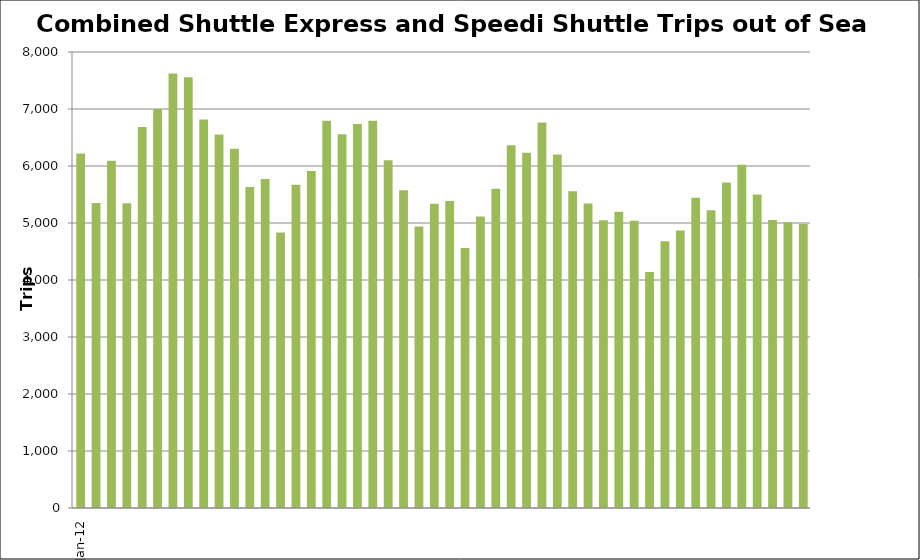
| Category | Shuttle Express |
|---|---|
| 2012-01-31 | 6218 |
| 2012-02-29 | 5351 |
| 2012-03-31 | 6093 |
| 2012-04-30 | 5348 |
| 2012-05-31 | 6683 |
| 2012-06-30 | 6998 |
| 2012-07-31 | 7622 |
| 2012-08-31 | 7558 |
| 2012-09-30 | 6817 |
| 2012-10-31 | 6553 |
| 2012-11-30 | 6301 |
| 2012-12-31 | 5632 |
| 2013-01-31 | 5770 |
| 2013-02-28 | 4833 |
| 2013-03-31 | 5669 |
| 2013-04-30 | 5912 |
| 2013-05-31 | 6793 |
| 2013-06-30 | 6559 |
| 2013-07-31 | 6738 |
| 2013-08-31 | 6793 |
| 2013-09-30 | 6101 |
| 2013-10-31 | 5576 |
| 2013-11-30 | 4939 |
| 2013-12-31 | 5336 |
| 2014-01-31 | 5388 |
| 2014-02-28 | 4560 |
| 2014-03-31 | 5115 |
| 2014-04-30 | 5603 |
| 2014-05-31 | 6366 |
| 2014-06-30 | 6233 |
| 2014-07-31 | 6761 |
| 2014-08-31 | 6202 |
| 2014-09-30 | 5559 |
| 2014-10-31 | 5343 |
| 2014-11-30 | 5048 |
| 2014-12-31 | 5196 |
| 2015-01-31 | 5038 |
| 2015-02-28 | 4140 |
| 2015-03-31 | 4680 |
| 2015-04-30 | 4870 |
| 2015-05-31 | 5445 |
| 2015-06-30 | 5222 |
| 2015-07-31 | 5712 |
| 2015-08-31 | 6020 |
| 2015-09-30 | 5498 |
| 2015-10-31 | 5054 |
| 2015-11-30 | 5013 |
| 2015-12-31 | 4983 |